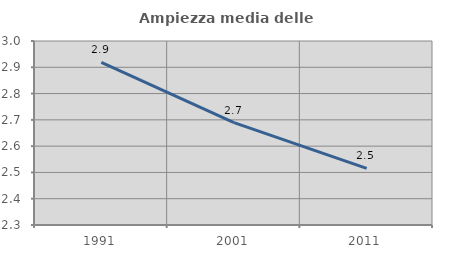
| Category | Ampiezza media delle famiglie |
|---|---|
| 1991.0 | 2.918 |
| 2001.0 | 2.69 |
| 2011.0 | 2.516 |